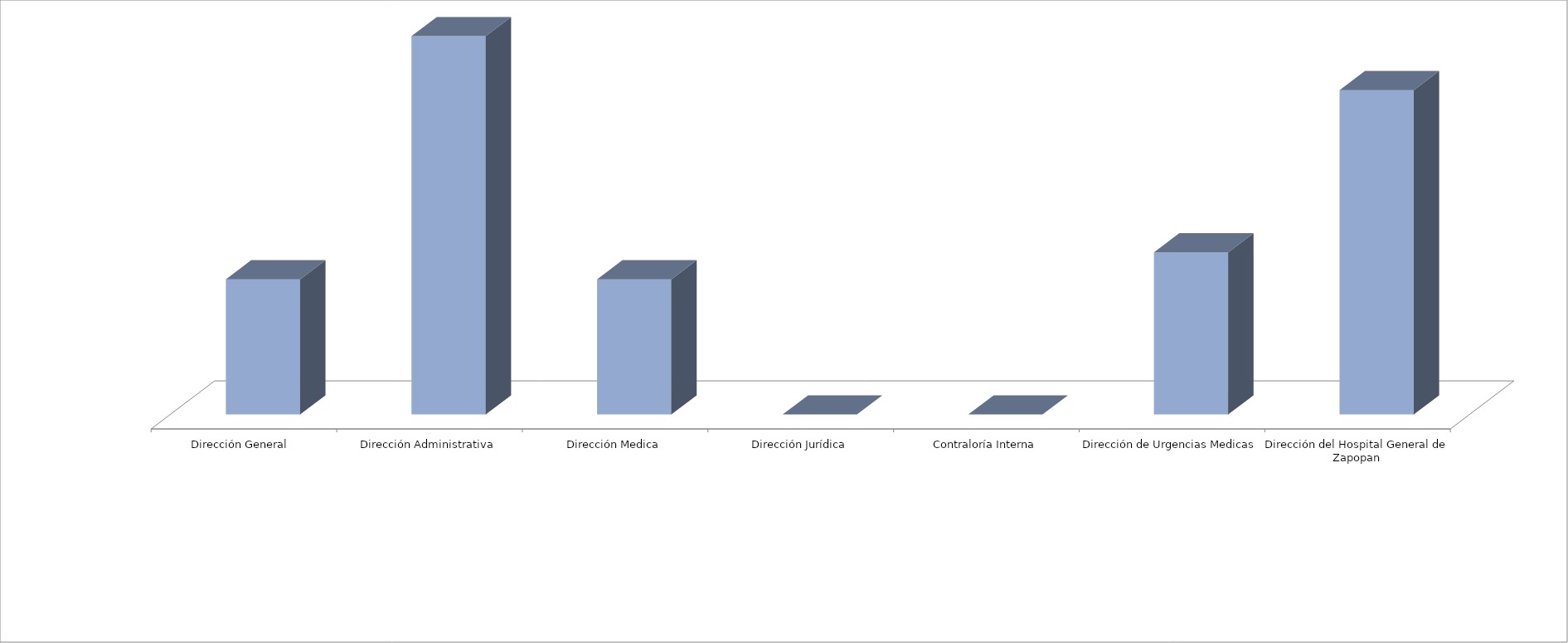
| Category | Series 0 | Series 1 |
|---|---|---|
| Dirección General  |  | 5 |
| Dirección Administrativa |  | 14 |
| Dirección Medica |  | 5 |
| Dirección Jurídica |  | 0 |
| Contraloría Interna |  | 0 |
| Dirección de Urgencias Medicas |  | 6 |
| Dirección del Hospital General de Zapopan |  | 12 |